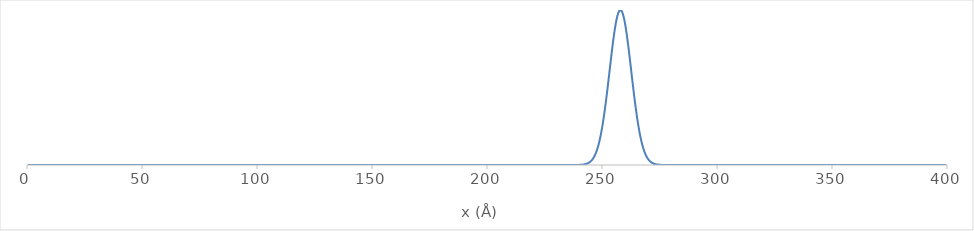
| Category | Series 0 |
|---|---|
| 0.3333333333333333 | 0 |
| 0.6666666666666666 | 0 |
| 1.0 | 0 |
| 1.3333333333333333 | 0 |
| 1.6666666666666667 | 0 |
| 2.0 | 0 |
| 2.3333333333333335 | 0 |
| 2.6666666666666665 | 0 |
| 3.0 | 0 |
| 3.3333333333333335 | 0 |
| 3.6666666666666665 | 0 |
| 4.0 | 0 |
| 4.333333333333333 | 0 |
| 4.666666666666667 | 0 |
| 5.0 | 0 |
| 5.333333333333333 | 0 |
| 5.666666666666667 | 0 |
| 6.0 | 0 |
| 6.333333333333333 | 0 |
| 6.666666666666667 | 0 |
| 7.0 | 0 |
| 7.333333333333333 | 0 |
| 7.666666666666667 | 0 |
| 8.0 | 0 |
| 8.333333333333334 | 0 |
| 8.666666666666666 | 0 |
| 9.0 | 0 |
| 9.333333333333334 | 0 |
| 9.666666666666666 | 0 |
| 10.0 | 0 |
| 10.333333333333334 | 0 |
| 10.666666666666666 | 0 |
| 11.0 | 0 |
| 11.333333333333334 | 0 |
| 11.666666666666666 | 0 |
| 12.0 | 0 |
| 12.333333333333334 | 0 |
| 12.666666666666666 | 0 |
| 13.0 | 0 |
| 13.333333333333334 | 0 |
| 13.666666666666666 | 0 |
| 14.0 | 0 |
| 14.333333333333334 | 0 |
| 14.666666666666666 | 0 |
| 15.0 | 0 |
| 15.333333333333334 | 0 |
| 15.666666666666666 | 0 |
| 16.0 | 0 |
| 16.333333333333332 | 0 |
| 16.666666666666668 | 0 |
| 17.0 | 0 |
| 17.333333333333332 | 0 |
| 17.666666666666668 | 0 |
| 18.0 | 0 |
| 18.333333333333332 | 0 |
| 18.666666666666668 | 0 |
| 19.0 | 0 |
| 19.333333333333332 | 0 |
| 19.666666666666668 | 0 |
| 20.0 | 0 |
| 20.333333333333332 | 0 |
| 20.666666666666668 | 0 |
| 21.0 | 0 |
| 21.333333333333332 | 0 |
| 21.666666666666668 | 0 |
| 22.0 | 0 |
| 22.333333333333332 | 0 |
| 22.666666666666668 | 0 |
| 23.0 | 0 |
| 23.333333333333332 | 0 |
| 23.666666666666668 | 0 |
| 24.0 | 0 |
| 24.333333333333332 | 0 |
| 24.666666666666668 | 0 |
| 25.0 | 0 |
| 25.333333333333332 | 0 |
| 25.666666666666668 | 0 |
| 26.0 | 0 |
| 26.333333333333332 | 0 |
| 26.666666666666668 | 0 |
| 27.0 | 0 |
| 27.333333333333332 | 0 |
| 27.666666666666668 | 0 |
| 28.0 | 0 |
| 28.333333333333332 | 0 |
| 28.666666666666668 | 0 |
| 29.0 | 0 |
| 29.333333333333332 | 0 |
| 29.666666666666668 | 0 |
| 30.0 | 0 |
| 30.333333333333332 | 0 |
| 30.666666666666668 | 0 |
| 31.0 | 0 |
| 31.333333333333332 | 0 |
| 31.666666666666668 | 0 |
| 32.0 | 0 |
| 32.333333333333336 | 0 |
| 32.666666666666664 | 0 |
| 33.0 | 0 |
| 33.333333333333336 | 0 |
| 33.666666666666664 | 0 |
| 34.0 | 0 |
| 34.333333333333336 | 0 |
| 34.666666666666664 | 0 |
| 35.0 | 0 |
| 35.333333333333336 | 0 |
| 35.666666666666664 | 0 |
| 36.0 | 0 |
| 36.333333333333336 | 0 |
| 36.666666666666664 | 0 |
| 37.0 | 0 |
| 37.333333333333336 | 0 |
| 37.666666666666664 | 0 |
| 38.0 | 0 |
| 38.333333333333336 | 0 |
| 38.666666666666664 | 0 |
| 39.0 | 0 |
| 39.333333333333336 | 0 |
| 39.666666666666664 | 0 |
| 40.0 | 0 |
| 40.333333333333336 | 0 |
| 40.666666666666664 | 0 |
| 41.0 | 0 |
| 41.333333333333336 | 0 |
| 41.666666666666664 | 0 |
| 42.0 | 0 |
| 42.333333333333336 | 0 |
| 42.666666666666664 | 0 |
| 43.0 | 0 |
| 43.333333333333336 | 0 |
| 43.666666666666664 | 0 |
| 44.0 | 0 |
| 44.333333333333336 | 0 |
| 44.666666666666664 | 0 |
| 45.0 | 0 |
| 45.333333333333336 | 0 |
| 45.666666666666664 | 0 |
| 46.0 | 0 |
| 46.333333333333336 | 0 |
| 46.666666666666664 | 0 |
| 47.0 | 0 |
| 47.333333333333336 | 0 |
| 47.666666666666664 | 0 |
| 48.0 | 0 |
| 48.333333333333336 | 0 |
| 48.666666666666664 | 0 |
| 49.0 | 0 |
| 49.333333333333336 | 0 |
| 49.666666666666664 | 0 |
| 50.0 | 0 |
| 50.333333333333336 | 0 |
| 50.666666666666664 | 0 |
| 51.0 | 0 |
| 51.333333333333336 | 0 |
| 51.666666666666664 | 0 |
| 52.0 | 0 |
| 52.333333333333336 | 0 |
| 52.666666666666664 | 0 |
| 53.0 | 0 |
| 53.333333333333336 | 0 |
| 53.666666666666664 | 0 |
| 54.0 | 0 |
| 54.333333333333336 | 0 |
| 54.666666666666664 | 0 |
| 55.0 | 0 |
| 55.333333333333336 | 0 |
| 55.666666666666664 | 0 |
| 56.0 | 0 |
| 56.333333333333336 | 0 |
| 56.666666666666664 | 0 |
| 57.0 | 0 |
| 57.333333333333336 | 0 |
| 57.666666666666664 | 0 |
| 58.0 | 0 |
| 58.333333333333336 | 0 |
| 58.666666666666664 | 0 |
| 59.0 | 0 |
| 59.333333333333336 | 0 |
| 59.666666666666664 | 0 |
| 60.0 | 0 |
| 60.333333333333336 | 0 |
| 60.666666666666664 | 0 |
| 61.0 | 0 |
| 61.333333333333336 | 0 |
| 61.666666666666664 | 0 |
| 62.0 | 0 |
| 62.333333333333336 | 0 |
| 62.666666666666664 | 0 |
| 63.0 | 0 |
| 63.333333333333336 | 0 |
| 63.666666666666664 | 0 |
| 64.0 | 0 |
| 64.33333333333333 | 0 |
| 64.66666666666667 | 0 |
| 65.0 | 0 |
| 65.33333333333333 | 0 |
| 65.66666666666667 | 0 |
| 66.0 | 0 |
| 66.33333333333333 | 0 |
| 66.66666666666667 | 0 |
| 67.0 | 0 |
| 67.33333333333333 | 0 |
| 67.66666666666667 | 0 |
| 68.0 | 0 |
| 68.33333333333333 | 0 |
| 68.66666666666667 | 0 |
| 69.0 | 0 |
| 69.33333333333333 | 0 |
| 69.66666666666667 | 0 |
| 70.0 | 0 |
| 70.33333333333333 | 0 |
| 70.66666666666667 | 0 |
| 71.0 | 0 |
| 71.33333333333333 | 0 |
| 71.66666666666667 | 0 |
| 72.0 | 0 |
| 72.33333333333333 | 0 |
| 72.66666666666667 | 0 |
| 73.0 | 0 |
| 73.33333333333333 | 0 |
| 73.66666666666667 | 0 |
| 74.0 | 0 |
| 74.33333333333333 | 0 |
| 74.66666666666667 | 0 |
| 75.0 | 0 |
| 75.33333333333333 | 0 |
| 75.66666666666667 | 0 |
| 76.0 | 0 |
| 76.33333333333333 | 0 |
| 76.66666666666667 | 0 |
| 77.0 | 0 |
| 77.33333333333333 | 0 |
| 77.66666666666667 | 0 |
| 78.0 | 0 |
| 78.33333333333333 | 0 |
| 78.66666666666667 | 0 |
| 79.0 | 0 |
| 79.33333333333333 | 0 |
| 79.66666666666667 | 0 |
| 80.0 | 0 |
| 80.33333333333333 | 0 |
| 80.66666666666667 | 0 |
| 81.0 | 0 |
| 81.33333333333333 | 0 |
| 81.66666666666667 | 0 |
| 82.0 | 0 |
| 82.33333333333333 | 0 |
| 82.66666666666667 | 0 |
| 83.0 | 0 |
| 83.33333333333333 | 0 |
| 83.66666666666667 | 0 |
| 84.0 | 0 |
| 84.33333333333333 | 0 |
| 84.66666666666667 | 0 |
| 85.0 | 0 |
| 85.33333333333333 | 0 |
| 85.66666666666667 | 0 |
| 86.0 | 0 |
| 86.33333333333333 | 0 |
| 86.66666666666667 | 0 |
| 87.0 | 0 |
| 87.33333333333333 | 0 |
| 87.66666666666667 | 0 |
| 88.0 | 0 |
| 88.33333333333333 | 0 |
| 88.66666666666667 | 0 |
| 89.0 | 0 |
| 89.33333333333333 | 0 |
| 89.66666666666667 | 0 |
| 90.0 | 0 |
| 90.33333333333333 | 0 |
| 90.66666666666667 | 0 |
| 91.0 | 0 |
| 91.33333333333333 | 0 |
| 91.66666666666667 | 0 |
| 92.0 | 0 |
| 92.33333333333333 | 0 |
| 92.66666666666667 | 0 |
| 93.0 | 0 |
| 93.33333333333333 | 0 |
| 93.66666666666667 | 0 |
| 94.0 | 0 |
| 94.33333333333333 | 0 |
| 94.66666666666667 | 0 |
| 95.0 | 0 |
| 95.33333333333333 | 0 |
| 95.66666666666667 | 0 |
| 96.0 | 0 |
| 96.33333333333333 | 0 |
| 96.66666666666667 | 0 |
| 97.0 | 0 |
| 97.33333333333333 | 0 |
| 97.66666666666667 | 0 |
| 98.0 | 0 |
| 98.33333333333333 | 0 |
| 98.66666666666667 | 0 |
| 99.0 | 0 |
| 99.33333333333333 | 0 |
| 99.66666666666667 | 0 |
| 100.0 | 0 |
| 100.33333333333333 | 0 |
| 100.66666666666667 | 0 |
| 101.0 | 0 |
| 101.33333333333333 | 0 |
| 101.66666666666667 | 0 |
| 102.0 | 0 |
| 102.33333333333333 | 0 |
| 102.66666666666667 | 0 |
| 103.0 | 0 |
| 103.33333333333333 | 0 |
| 103.66666666666667 | 0 |
| 104.0 | 0 |
| 104.33333333333333 | 0 |
| 104.66666666666667 | 0 |
| 105.0 | 0 |
| 105.33333333333333 | 0 |
| 105.66666666666667 | 0 |
| 106.0 | 0 |
| 106.33333333333333 | 0 |
| 106.66666666666667 | 0 |
| 107.0 | 0 |
| 107.33333333333333 | 0 |
| 107.66666666666667 | 0 |
| 108.0 | 0 |
| 108.33333333333333 | 0 |
| 108.66666666666667 | 0 |
| 109.0 | 0 |
| 109.33333333333333 | 0 |
| 109.66666666666667 | 0 |
| 110.0 | 0 |
| 110.33333333333333 | 0 |
| 110.66666666666667 | 0 |
| 111.0 | 0 |
| 111.33333333333333 | 0 |
| 111.66666666666667 | 0 |
| 112.0 | 0 |
| 112.33333333333333 | 0 |
| 112.66666666666667 | 0 |
| 113.0 | 0 |
| 113.33333333333333 | 0 |
| 113.66666666666667 | 0 |
| 114.0 | 0 |
| 114.33333333333333 | 0 |
| 114.66666666666667 | 0 |
| 115.0 | 0 |
| 115.33333333333333 | 0 |
| 115.66666666666667 | 0 |
| 116.0 | 0 |
| 116.33333333333333 | 0 |
| 116.66666666666667 | 0 |
| 117.0 | 0 |
| 117.33333333333333 | 0 |
| 117.66666666666667 | 0 |
| 118.0 | 0 |
| 118.33333333333333 | 0 |
| 118.66666666666667 | 0 |
| 119.0 | 0 |
| 119.33333333333333 | 0 |
| 119.66666666666667 | 0 |
| 120.0 | 0 |
| 120.33333333333333 | 0 |
| 120.66666666666667 | 0 |
| 121.0 | 0 |
| 121.33333333333333 | 0 |
| 121.66666666666667 | 0 |
| 122.0 | 0 |
| 122.33333333333333 | 0 |
| 122.66666666666667 | 0 |
| 123.0 | 0 |
| 123.33333333333333 | 0 |
| 123.66666666666667 | 0 |
| 124.0 | 0 |
| 124.33333333333333 | 0 |
| 124.66666666666667 | 0 |
| 125.0 | 0 |
| 125.33333333333333 | 0 |
| 125.66666666666667 | 0 |
| 126.0 | 0 |
| 126.33333333333333 | 0 |
| 126.66666666666667 | 0 |
| 127.0 | 0 |
| 127.33333333333333 | 0 |
| 127.66666666666667 | 0 |
| 128.0 | 0 |
| 128.33333333333334 | 0 |
| 128.66666666666666 | 0 |
| 129.0 | 0 |
| 129.33333333333334 | 0 |
| 129.66666666666666 | 0 |
| 130.0 | 0 |
| 130.33333333333334 | 0 |
| 130.66666666666666 | 0 |
| 131.0 | 0 |
| 131.33333333333334 | 0 |
| 131.66666666666666 | 0 |
| 132.0 | 0 |
| 132.33333333333334 | 0 |
| 132.66666666666666 | 0 |
| 133.0 | 0 |
| 133.33333333333334 | 0 |
| 133.66666666666666 | 0 |
| 134.0 | 0 |
| 134.33333333333334 | 0 |
| 134.66666666666666 | 0 |
| 135.0 | 0 |
| 135.33333333333334 | 0 |
| 135.66666666666666 | 0 |
| 136.0 | 0 |
| 136.33333333333334 | 0 |
| 136.66666666666666 | 0 |
| 137.0 | 0 |
| 137.33333333333334 | 0 |
| 137.66666666666666 | 0 |
| 138.0 | 0 |
| 138.33333333333334 | 0 |
| 138.66666666666666 | 0 |
| 139.0 | 0 |
| 139.33333333333334 | 0 |
| 139.66666666666666 | 0 |
| 140.0 | 0 |
| 140.33333333333334 | 0 |
| 140.66666666666666 | 0 |
| 141.0 | 0 |
| 141.33333333333334 | 0 |
| 141.66666666666666 | 0 |
| 142.0 | 0 |
| 142.33333333333334 | 0 |
| 142.66666666666666 | 0 |
| 143.0 | 0 |
| 143.33333333333334 | 0 |
| 143.66666666666666 | 0 |
| 144.0 | 0 |
| 144.33333333333334 | 0 |
| 144.66666666666666 | 0 |
| 145.0 | 0 |
| 145.33333333333334 | 0 |
| 145.66666666666666 | 0 |
| 146.0 | 0 |
| 146.33333333333334 | 0 |
| 146.66666666666666 | 0 |
| 147.0 | 0 |
| 147.33333333333334 | 0 |
| 147.66666666666666 | 0 |
| 148.0 | 0 |
| 148.33333333333334 | 0 |
| 148.66666666666666 | 0 |
| 149.0 | 0 |
| 149.33333333333334 | 0 |
| 149.66666666666666 | 0 |
| 150.0 | 0 |
| 150.33333333333334 | 0 |
| 150.66666666666666 | 0 |
| 151.0 | 0 |
| 151.33333333333334 | 0 |
| 151.66666666666666 | 0 |
| 152.0 | 0 |
| 152.33333333333334 | 0 |
| 152.66666666666666 | 0 |
| 153.0 | 0 |
| 153.33333333333334 | 0 |
| 153.66666666666666 | 0 |
| 154.0 | 0 |
| 154.33333333333334 | 0 |
| 154.66666666666666 | 0 |
| 155.0 | 0 |
| 155.33333333333334 | 0 |
| 155.66666666666666 | 0 |
| 156.0 | 0 |
| 156.33333333333334 | 0 |
| 156.66666666666666 | 0 |
| 157.0 | 0 |
| 157.33333333333334 | 0 |
| 157.66666666666666 | 0 |
| 158.0 | 0 |
| 158.33333333333334 | 0 |
| 158.66666666666666 | 0 |
| 159.0 | 0 |
| 159.33333333333334 | 0 |
| 159.66666666666666 | 0 |
| 160.0 | 0 |
| 160.33333333333334 | 0 |
| 160.66666666666666 | 0 |
| 161.0 | 0 |
| 161.33333333333334 | 0 |
| 161.66666666666666 | 0 |
| 162.0 | 0 |
| 162.33333333333334 | 0 |
| 162.66666666666666 | 0 |
| 163.0 | 0 |
| 163.33333333333334 | 0 |
| 163.66666666666666 | 0 |
| 164.0 | 0 |
| 164.33333333333334 | 0 |
| 164.66666666666666 | 0 |
| 165.0 | 0 |
| 165.33333333333334 | 0 |
| 165.66666666666666 | 0 |
| 166.0 | 0 |
| 166.33333333333334 | 0 |
| 166.66666666666666 | 0 |
| 167.0 | 0 |
| 167.33333333333334 | 0 |
| 167.66666666666666 | 0 |
| 168.0 | 0 |
| 168.33333333333334 | 0 |
| 168.66666666666666 | 0 |
| 169.0 | 0 |
| 169.33333333333334 | 0 |
| 169.66666666666666 | 0 |
| 170.0 | 0 |
| 170.33333333333334 | 0 |
| 170.66666666666666 | 0 |
| 171.0 | 0 |
| 171.33333333333334 | 0 |
| 171.66666666666666 | 0 |
| 172.0 | 0 |
| 172.33333333333334 | 0 |
| 172.66666666666666 | 0 |
| 173.0 | 0 |
| 173.33333333333334 | 0 |
| 173.66666666666666 | 0 |
| 174.0 | 0 |
| 174.33333333333334 | 0 |
| 174.66666666666666 | 0 |
| 175.0 | 0 |
| 175.33333333333334 | 0 |
| 175.66666666666666 | 0 |
| 176.0 | 0 |
| 176.33333333333334 | 0 |
| 176.66666666666666 | 0 |
| 177.0 | 0 |
| 177.33333333333334 | 0 |
| 177.66666666666666 | 0 |
| 178.0 | 0 |
| 178.33333333333334 | 0 |
| 178.66666666666666 | 0 |
| 179.0 | 0 |
| 179.33333333333334 | 0 |
| 179.66666666666666 | 0 |
| 180.0 | 0 |
| 180.33333333333334 | 0 |
| 180.66666666666666 | 0 |
| 181.0 | 0 |
| 181.33333333333334 | 0 |
| 181.66666666666666 | 0 |
| 182.0 | 0 |
| 182.33333333333334 | 0 |
| 182.66666666666666 | 0 |
| 183.0 | 0 |
| 183.33333333333334 | 0 |
| 183.66666666666666 | 0 |
| 184.0 | 0 |
| 184.33333333333334 | 0 |
| 184.66666666666666 | 0 |
| 185.0 | 0 |
| 185.33333333333334 | 0 |
| 185.66666666666666 | 0 |
| 186.0 | 0 |
| 186.33333333333334 | 0 |
| 186.66666666666666 | 0 |
| 187.0 | 0 |
| 187.33333333333334 | 0 |
| 187.66666666666666 | 0 |
| 188.0 | 0 |
| 188.33333333333334 | 0 |
| 188.66666666666666 | 0 |
| 189.0 | 0 |
| 189.33333333333334 | 0 |
| 189.66666666666666 | 0 |
| 190.0 | 0 |
| 190.33333333333334 | 0 |
| 190.66666666666666 | 0 |
| 191.0 | 0 |
| 191.33333333333334 | 0 |
| 191.66666666666666 | 0 |
| 192.0 | 0 |
| 192.33333333333334 | 0 |
| 192.66666666666666 | 0 |
| 193.0 | 0 |
| 193.33333333333334 | 0 |
| 193.66666666666666 | 0 |
| 194.0 | 0 |
| 194.33333333333334 | 0 |
| 194.66666666666666 | 0 |
| 195.0 | 0 |
| 195.33333333333334 | 0 |
| 195.66666666666666 | 0 |
| 196.0 | 0 |
| 196.33333333333334 | 0 |
| 196.66666666666666 | 0 |
| 197.0 | 0 |
| 197.33333333333334 | 0 |
| 197.66666666666666 | 0 |
| 198.0 | 0 |
| 198.33333333333334 | 0 |
| 198.66666666666666 | 0 |
| 199.0 | 0 |
| 199.33333333333334 | 0 |
| 199.66666666666666 | 0 |
| 200.0 | 0 |
| 200.33333333333334 | 0 |
| 200.66666666666666 | 0 |
| 201.0 | 0 |
| 201.33333333333334 | 0 |
| 201.66666666666666 | 0 |
| 202.0 | 0 |
| 202.33333333333334 | 0 |
| 202.66666666666666 | 0 |
| 203.0 | 0 |
| 203.33333333333334 | 0 |
| 203.66666666666666 | 0 |
| 204.0 | 0 |
| 204.33333333333334 | 0 |
| 204.66666666666666 | 0 |
| 205.0 | 0 |
| 205.33333333333334 | 0 |
| 205.66666666666666 | 0 |
| 206.0 | 0 |
| 206.33333333333334 | 0 |
| 206.66666666666666 | 0 |
| 207.0 | 0 |
| 207.33333333333334 | 0 |
| 207.66666666666666 | 0 |
| 208.0 | 0 |
| 208.33333333333334 | 0 |
| 208.66666666666666 | 0 |
| 209.0 | 0 |
| 209.33333333333334 | 0 |
| 209.66666666666666 | 0 |
| 210.0 | 0 |
| 210.33333333333334 | 0 |
| 210.66666666666666 | 0 |
| 211.0 | 0 |
| 211.33333333333334 | 0 |
| 211.66666666666666 | 0 |
| 212.0 | 0 |
| 212.33333333333334 | 0 |
| 212.66666666666666 | 0 |
| 213.0 | 0 |
| 213.33333333333334 | 0 |
| 213.66666666666666 | 0 |
| 214.0 | 0 |
| 214.33333333333334 | 0 |
| 214.66666666666666 | 0 |
| 215.0 | 0 |
| 215.33333333333334 | 0 |
| 215.66666666666666 | 0 |
| 216.0 | 0 |
| 216.33333333333334 | 0 |
| 216.66666666666666 | 0 |
| 217.0 | 0 |
| 217.33333333333334 | 0 |
| 217.66666666666666 | 0 |
| 218.0 | 0 |
| 218.33333333333334 | 0 |
| 218.66666666666666 | 0 |
| 219.0 | 0 |
| 219.33333333333334 | 0 |
| 219.66666666666666 | 0 |
| 220.0 | 0 |
| 220.33333333333334 | 0 |
| 220.66666666666666 | 0 |
| 221.0 | 0 |
| 221.33333333333334 | 0 |
| 221.66666666666666 | 0 |
| 222.0 | 0 |
| 222.33333333333334 | 0 |
| 222.66666666666666 | 0 |
| 223.0 | 0 |
| 223.33333333333334 | 0 |
| 223.66666666666666 | 0 |
| 224.0 | 0 |
| 224.33333333333334 | 0 |
| 224.66666666666666 | 0 |
| 225.0 | 0 |
| 225.33333333333334 | 0 |
| 225.66666666666666 | 0 |
| 226.0 | 0 |
| 226.33333333333334 | 0 |
| 226.66666666666666 | 0 |
| 227.0 | 0 |
| 227.33333333333334 | 0 |
| 227.66666666666666 | 0 |
| 228.0 | 0 |
| 228.33333333333334 | 0 |
| 228.66666666666666 | 0 |
| 229.0 | 0 |
| 229.33333333333334 | 0 |
| 229.66666666666666 | 0 |
| 230.0 | 0 |
| 230.33333333333334 | 0 |
| 230.66666666666666 | 0 |
| 231.0 | 0 |
| 231.33333333333334 | 0 |
| 231.66666666666666 | 0 |
| 232.0 | 0 |
| 232.33333333333334 | 0 |
| 232.66666666666666 | 0 |
| 233.0 | 0 |
| 233.33333333333334 | 0 |
| 233.66666666666666 | 0 |
| 234.0 | 0 |
| 234.33333333333334 | 0 |
| 234.66666666666666 | 0 |
| 235.0 | 0 |
| 235.33333333333334 | 0 |
| 235.66666666666666 | 0 |
| 236.0 | 0 |
| 236.33333333333334 | 0 |
| 236.66666666666666 | 0 |
| 237.0 | 0 |
| 237.33333333333334 | 0 |
| 237.66666666666666 | 0 |
| 238.0 | 0 |
| 238.33333333333334 | 0 |
| 238.66666666666666 | 0 |
| 239.0 | 0 |
| 239.33333333333334 | 0 |
| 239.66666666666666 | 0.001 |
| 240.0 | 0.001 |
| 240.33333333333334 | 0.001 |
| 240.66666666666666 | 0.001 |
| 241.0 | 0.001 |
| 241.33333333333334 | 0.002 |
| 241.66666666666666 | 0.002 |
| 242.0 | 0.003 |
| 242.33333333333334 | 0.004 |
| 242.66666666666666 | 0.005 |
| 243.0 | 0.006 |
| 243.33333333333334 | 0.008 |
| 243.66666666666666 | 0.01 |
| 244.0 | 0.012 |
| 244.33333333333334 | 0.015 |
| 244.66666666666666 | 0.018 |
| 245.0 | 0.022 |
| 245.33333333333334 | 0.027 |
| 245.66666666666666 | 0.033 |
| 246.0 | 0.039 |
| 246.33333333333334 | 0.047 |
| 246.66666666666666 | 0.056 |
| 247.0 | 0.066 |
| 247.33333333333334 | 0.077 |
| 247.66666666666666 | 0.09 |
| 248.0 | 0.105 |
| 248.33333333333334 | 0.122 |
| 248.66666666666666 | 0.141 |
| 249.0 | 0.162 |
| 249.33333333333334 | 0.185 |
| 249.66666666666666 | 0.21 |
| 250.0 | 0.237 |
| 250.33333333333334 | 0.266 |
| 250.66666666666666 | 0.298 |
| 251.0 | 0.332 |
| 251.33333333333334 | 0.368 |
| 251.66666666666666 | 0.406 |
| 252.0 | 0.445 |
| 252.33333333333334 | 0.486 |
| 252.66666666666666 | 0.527 |
| 253.0 | 0.57 |
| 253.33333333333334 | 0.613 |
| 253.66666666666666 | 0.655 |
| 254.0 | 0.698 |
| 254.33333333333334 | 0.739 |
| 254.66666666666666 | 0.779 |
| 255.0 | 0.817 |
| 255.33333333333334 | 0.852 |
| 255.66666666666666 | 0.885 |
| 256.0 | 0.914 |
| 256.3333333333333 | 0.939 |
| 256.6666666666667 | 0.961 |
| 257.0 | 0.978 |
| 257.3333333333333 | 0.99 |
| 257.6666666666667 | 0.998 |
| 258.0 | 1 |
| 258.3333333333333 | 0.998 |
| 258.6666666666667 | 0.99 |
| 259.0 | 0.978 |
| 259.3333333333333 | 0.961 |
| 259.6666666666667 | 0.939 |
| 260.0 | 0.914 |
| 260.3333333333333 | 0.885 |
| 260.6666666666667 | 0.852 |
| 261.0 | 0.817 |
| 261.3333333333333 | 0.779 |
| 261.6666666666667 | 0.739 |
| 262.0 | 0.698 |
| 262.3333333333333 | 0.655 |
| 262.6666666666667 | 0.613 |
| 263.0 | 0.57 |
| 263.3333333333333 | 0.527 |
| 263.6666666666667 | 0.486 |
| 264.0 | 0.445 |
| 264.3333333333333 | 0.406 |
| 264.6666666666667 | 0.368 |
| 265.0 | 0.332 |
| 265.3333333333333 | 0.298 |
| 265.6666666666667 | 0.266 |
| 266.0 | 0.237 |
| 266.3333333333333 | 0.21 |
| 266.6666666666667 | 0.185 |
| 267.0 | 0.162 |
| 267.3333333333333 | 0.141 |
| 267.6666666666667 | 0.122 |
| 268.0 | 0.105 |
| 268.3333333333333 | 0.09 |
| 268.6666666666667 | 0.077 |
| 269.0 | 0.066 |
| 269.3333333333333 | 0.056 |
| 269.6666666666667 | 0.047 |
| 270.0 | 0.039 |
| 270.3333333333333 | 0.033 |
| 270.6666666666667 | 0.027 |
| 271.0 | 0.022 |
| 271.3333333333333 | 0.018 |
| 271.6666666666667 | 0.015 |
| 272.0 | 0.012 |
| 272.3333333333333 | 0.01 |
| 272.6666666666667 | 0.008 |
| 273.0 | 0.006 |
| 273.3333333333333 | 0.005 |
| 273.6666666666667 | 0.004 |
| 274.0 | 0.003 |
| 274.3333333333333 | 0.002 |
| 274.6666666666667 | 0.002 |
| 275.0 | 0.001 |
| 275.3333333333333 | 0.001 |
| 275.6666666666667 | 0.001 |
| 276.0 | 0.001 |
| 276.3333333333333 | 0.001 |
| 276.6666666666667 | 0 |
| 277.0 | 0 |
| 277.3333333333333 | 0 |
| 277.6666666666667 | 0 |
| 278.0 | 0 |
| 278.3333333333333 | 0 |
| 278.6666666666667 | 0 |
| 279.0 | 0 |
| 279.3333333333333 | 0 |
| 279.6666666666667 | 0 |
| 280.0 | 0 |
| 280.3333333333333 | 0 |
| 280.6666666666667 | 0 |
| 281.0 | 0 |
| 281.3333333333333 | 0 |
| 281.6666666666667 | 0 |
| 282.0 | 0 |
| 282.3333333333333 | 0 |
| 282.6666666666667 | 0 |
| 283.0 | 0 |
| 283.3333333333333 | 0 |
| 283.6666666666667 | 0 |
| 284.0 | 0 |
| 284.3333333333333 | 0 |
| 284.6666666666667 | 0 |
| 285.0 | 0 |
| 285.3333333333333 | 0 |
| 285.6666666666667 | 0 |
| 286.0 | 0 |
| 286.3333333333333 | 0 |
| 286.6666666666667 | 0 |
| 287.0 | 0 |
| 287.3333333333333 | 0 |
| 287.6666666666667 | 0 |
| 288.0 | 0 |
| 288.3333333333333 | 0 |
| 288.6666666666667 | 0 |
| 289.0 | 0 |
| 289.3333333333333 | 0 |
| 289.6666666666667 | 0 |
| 290.0 | 0 |
| 290.3333333333333 | 0 |
| 290.6666666666667 | 0 |
| 291.0 | 0 |
| 291.3333333333333 | 0 |
| 291.6666666666667 | 0 |
| 292.0 | 0 |
| 292.3333333333333 | 0 |
| 292.6666666666667 | 0 |
| 293.0 | 0 |
| 293.3333333333333 | 0 |
| 293.6666666666667 | 0 |
| 294.0 | 0 |
| 294.3333333333333 | 0 |
| 294.6666666666667 | 0 |
| 295.0 | 0 |
| 295.3333333333333 | 0 |
| 295.6666666666667 | 0 |
| 296.0 | 0 |
| 296.3333333333333 | 0 |
| 296.6666666666667 | 0 |
| 297.0 | 0 |
| 297.3333333333333 | 0 |
| 297.6666666666667 | 0 |
| 298.0 | 0 |
| 298.3333333333333 | 0 |
| 298.6666666666667 | 0 |
| 299.0 | 0 |
| 299.3333333333333 | 0 |
| 299.6666666666667 | 0 |
| 300.0 | 0 |
| 300.3333333333333 | 0 |
| 300.6666666666667 | 0 |
| 301.0 | 0 |
| 301.3333333333333 | 0 |
| 301.6666666666667 | 0 |
| 302.0 | 0 |
| 302.3333333333333 | 0 |
| 302.6666666666667 | 0 |
| 303.0 | 0 |
| 303.3333333333333 | 0 |
| 303.6666666666667 | 0 |
| 304.0 | 0 |
| 304.3333333333333 | 0 |
| 304.6666666666667 | 0 |
| 305.0 | 0 |
| 305.3333333333333 | 0 |
| 305.6666666666667 | 0 |
| 306.0 | 0 |
| 306.3333333333333 | 0 |
| 306.6666666666667 | 0 |
| 307.0 | 0 |
| 307.3333333333333 | 0 |
| 307.6666666666667 | 0 |
| 308.0 | 0 |
| 308.3333333333333 | 0 |
| 308.6666666666667 | 0 |
| 309.0 | 0 |
| 309.3333333333333 | 0 |
| 309.6666666666667 | 0 |
| 310.0 | 0 |
| 310.3333333333333 | 0 |
| 310.6666666666667 | 0 |
| 311.0 | 0 |
| 311.3333333333333 | 0 |
| 311.6666666666667 | 0 |
| 312.0 | 0 |
| 312.3333333333333 | 0 |
| 312.6666666666667 | 0 |
| 313.0 | 0 |
| 313.3333333333333 | 0 |
| 313.6666666666667 | 0 |
| 314.0 | 0 |
| 314.3333333333333 | 0 |
| 314.6666666666667 | 0 |
| 315.0 | 0 |
| 315.3333333333333 | 0 |
| 315.6666666666667 | 0 |
| 316.0 | 0 |
| 316.3333333333333 | 0 |
| 316.6666666666667 | 0 |
| 317.0 | 0 |
| 317.3333333333333 | 0 |
| 317.6666666666667 | 0 |
| 318.0 | 0 |
| 318.3333333333333 | 0 |
| 318.6666666666667 | 0 |
| 319.0 | 0 |
| 319.3333333333333 | 0 |
| 319.6666666666667 | 0 |
| 320.0 | 0 |
| 320.3333333333333 | 0 |
| 320.6666666666667 | 0 |
| 321.0 | 0 |
| 321.3333333333333 | 0 |
| 321.6666666666667 | 0 |
| 322.0 | 0 |
| 322.3333333333333 | 0 |
| 322.6666666666667 | 0 |
| 323.0 | 0 |
| 323.3333333333333 | 0 |
| 323.6666666666667 | 0 |
| 324.0 | 0 |
| 324.3333333333333 | 0 |
| 324.6666666666667 | 0 |
| 325.0 | 0 |
| 325.3333333333333 | 0 |
| 325.6666666666667 | 0 |
| 326.0 | 0 |
| 326.3333333333333 | 0 |
| 326.6666666666667 | 0 |
| 327.0 | 0 |
| 327.3333333333333 | 0 |
| 327.6666666666667 | 0 |
| 328.0 | 0 |
| 328.3333333333333 | 0 |
| 328.6666666666667 | 0 |
| 329.0 | 0 |
| 329.3333333333333 | 0 |
| 329.6666666666667 | 0 |
| 330.0 | 0 |
| 330.3333333333333 | 0 |
| 330.6666666666667 | 0 |
| 331.0 | 0 |
| 331.3333333333333 | 0 |
| 331.6666666666667 | 0 |
| 332.0 | 0 |
| 332.3333333333333 | 0 |
| 332.6666666666667 | 0 |
| 333.0 | 0 |
| 333.3333333333333 | 0 |
| 333.6666666666667 | 0 |
| 334.0 | 0 |
| 334.3333333333333 | 0 |
| 334.6666666666667 | 0 |
| 335.0 | 0 |
| 335.3333333333333 | 0 |
| 335.6666666666667 | 0 |
| 336.0 | 0 |
| 336.3333333333333 | 0 |
| 336.6666666666667 | 0 |
| 337.0 | 0 |
| 337.3333333333333 | 0 |
| 337.6666666666667 | 0 |
| 338.0 | 0 |
| 338.3333333333333 | 0 |
| 338.6666666666667 | 0 |
| 339.0 | 0 |
| 339.3333333333333 | 0 |
| 339.6666666666667 | 0 |
| 340.0 | 0 |
| 340.3333333333333 | 0 |
| 340.6666666666667 | 0 |
| 341.0 | 0 |
| 341.3333333333333 | 0 |
| 341.6666666666667 | 0 |
| 342.0 | 0 |
| 342.3333333333333 | 0 |
| 342.6666666666667 | 0 |
| 343.0 | 0 |
| 343.3333333333333 | 0 |
| 343.6666666666667 | 0 |
| 344.0 | 0 |
| 344.3333333333333 | 0 |
| 344.6666666666667 | 0 |
| 345.0 | 0 |
| 345.3333333333333 | 0 |
| 345.6666666666667 | 0 |
| 346.0 | 0 |
| 346.3333333333333 | 0 |
| 346.6666666666667 | 0 |
| 347.0 | 0 |
| 347.3333333333333 | 0 |
| 347.6666666666667 | 0 |
| 348.0 | 0 |
| 348.3333333333333 | 0 |
| 348.6666666666667 | 0 |
| 349.0 | 0 |
| 349.3333333333333 | 0 |
| 349.6666666666667 | 0 |
| 350.0 | 0 |
| 350.3333333333333 | 0 |
| 350.6666666666667 | 0 |
| 351.0 | 0 |
| 351.3333333333333 | 0 |
| 351.6666666666667 | 0 |
| 352.0 | 0 |
| 352.3333333333333 | 0 |
| 352.6666666666667 | 0 |
| 353.0 | 0 |
| 353.3333333333333 | 0 |
| 353.6666666666667 | 0 |
| 354.0 | 0 |
| 354.3333333333333 | 0 |
| 354.6666666666667 | 0 |
| 355.0 | 0 |
| 355.3333333333333 | 0 |
| 355.6666666666667 | 0 |
| 356.0 | 0 |
| 356.3333333333333 | 0 |
| 356.6666666666667 | 0 |
| 357.0 | 0 |
| 357.3333333333333 | 0 |
| 357.6666666666667 | 0 |
| 358.0 | 0 |
| 358.3333333333333 | 0 |
| 358.6666666666667 | 0 |
| 359.0 | 0 |
| 359.3333333333333 | 0 |
| 359.6666666666667 | 0 |
| 360.0 | 0 |
| 360.3333333333333 | 0 |
| 360.6666666666667 | 0 |
| 361.0 | 0 |
| 361.3333333333333 | 0 |
| 361.6666666666667 | 0 |
| 362.0 | 0 |
| 362.3333333333333 | 0 |
| 362.6666666666667 | 0 |
| 363.0 | 0 |
| 363.3333333333333 | 0 |
| 363.6666666666667 | 0 |
| 364.0 | 0 |
| 364.3333333333333 | 0 |
| 364.6666666666667 | 0 |
| 365.0 | 0 |
| 365.3333333333333 | 0 |
| 365.6666666666667 | 0 |
| 366.0 | 0 |
| 366.3333333333333 | 0 |
| 366.6666666666667 | 0 |
| 367.0 | 0 |
| 367.3333333333333 | 0 |
| 367.6666666666667 | 0 |
| 368.0 | 0 |
| 368.3333333333333 | 0 |
| 368.6666666666667 | 0 |
| 369.0 | 0 |
| 369.3333333333333 | 0 |
| 369.6666666666667 | 0 |
| 370.0 | 0 |
| 370.3333333333333 | 0 |
| 370.6666666666667 | 0 |
| 371.0 | 0 |
| 371.3333333333333 | 0 |
| 371.6666666666667 | 0 |
| 372.0 | 0 |
| 372.3333333333333 | 0 |
| 372.6666666666667 | 0 |
| 373.0 | 0 |
| 373.3333333333333 | 0 |
| 373.6666666666667 | 0 |
| 374.0 | 0 |
| 374.3333333333333 | 0 |
| 374.6666666666667 | 0 |
| 375.0 | 0 |
| 375.3333333333333 | 0 |
| 375.6666666666667 | 0 |
| 376.0 | 0 |
| 376.3333333333333 | 0 |
| 376.6666666666667 | 0 |
| 377.0 | 0 |
| 377.3333333333333 | 0 |
| 377.6666666666667 | 0 |
| 378.0 | 0 |
| 378.3333333333333 | 0 |
| 378.6666666666667 | 0 |
| 379.0 | 0 |
| 379.3333333333333 | 0 |
| 379.6666666666667 | 0 |
| 380.0 | 0 |
| 380.3333333333333 | 0 |
| 380.6666666666667 | 0 |
| 381.0 | 0 |
| 381.3333333333333 | 0 |
| 381.6666666666667 | 0 |
| 382.0 | 0 |
| 382.3333333333333 | 0 |
| 382.6666666666667 | 0 |
| 383.0 | 0 |
| 383.3333333333333 | 0 |
| 383.6666666666667 | 0 |
| 384.0 | 0 |
| 384.3333333333333 | 0 |
| 384.6666666666667 | 0 |
| 385.0 | 0 |
| 385.3333333333333 | 0 |
| 385.6666666666667 | 0 |
| 386.0 | 0 |
| 386.3333333333333 | 0 |
| 386.6666666666667 | 0 |
| 387.0 | 0 |
| 387.3333333333333 | 0 |
| 387.6666666666667 | 0 |
| 388.0 | 0 |
| 388.3333333333333 | 0 |
| 388.6666666666667 | 0 |
| 389.0 | 0 |
| 389.3333333333333 | 0 |
| 389.6666666666667 | 0 |
| 390.0 | 0 |
| 390.3333333333333 | 0 |
| 390.6666666666667 | 0 |
| 391.0 | 0 |
| 391.3333333333333 | 0 |
| 391.6666666666667 | 0 |
| 392.0 | 0 |
| 392.3333333333333 | 0 |
| 392.6666666666667 | 0 |
| 393.0 | 0 |
| 393.3333333333333 | 0 |
| 393.6666666666667 | 0 |
| 394.0 | 0 |
| 394.3333333333333 | 0 |
| 394.6666666666667 | 0 |
| 395.0 | 0 |
| 395.3333333333333 | 0 |
| 395.6666666666667 | 0 |
| 396.0 | 0 |
| 396.3333333333333 | 0 |
| 396.6666666666667 | 0 |
| 397.0 | 0 |
| 397.3333333333333 | 0 |
| 397.6666666666667 | 0 |
| 398.0 | 0 |
| 398.3333333333333 | 0 |
| 398.6666666666667 | 0 |
| 399.0 | 0 |
| 399.3333333333333 | 0 |
| 399.6666666666667 | 0 |
| 400.0 | 0 |